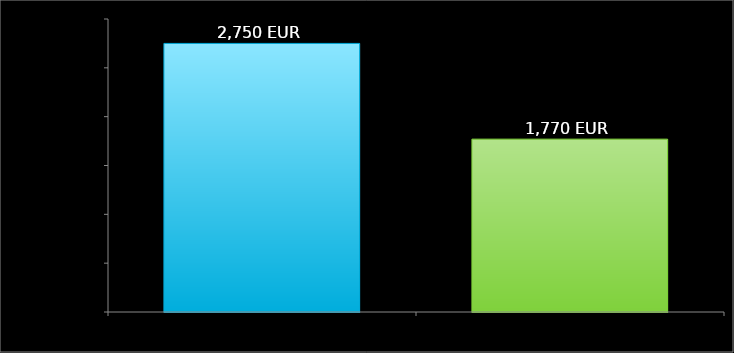
| Category | Údaje |
|---|---|
| príjem | 2750 |
| výdavky | 1770 |